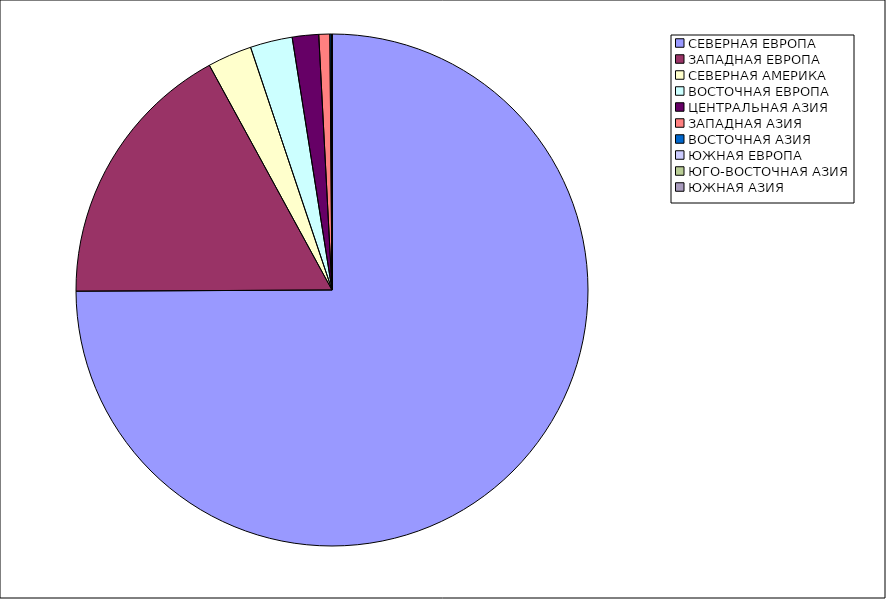
| Category | Оборот |
|---|---|
| СЕВЕРНАЯ ЕВРОПА | 74.925 |
| ЗАПАДНАЯ ЕВРОПА | 17.124 |
| СЕВЕРНАЯ АМЕРИКА | 2.801 |
| ВОСТОЧНАЯ ЕВРОПА | 2.66 |
| ЦЕНТРАЛЬНАЯ АЗИЯ | 1.665 |
| ЗАПАДНАЯ АЗИЯ | 0.694 |
| ВОСТОЧНАЯ АЗИЯ | 0.121 |
| ЮЖНАЯ ЕВРОПА | 0.01 |
| ЮГО-ВОСТОЧНАЯ АЗИЯ | 0 |
| ЮЖНАЯ АЗИЯ | 0 |